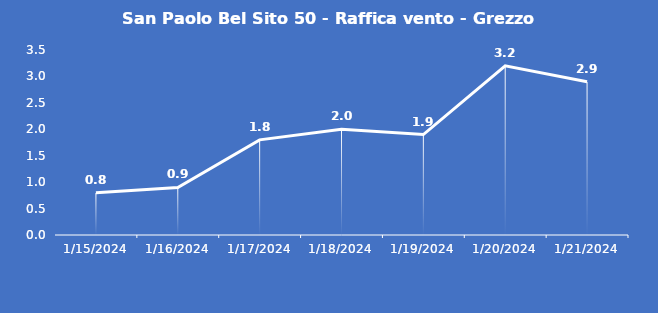
| Category | San Paolo Bel Sito 50 - Raffica vento - Grezzo (m/s) |
|---|---|
| 1/15/24 | 0.8 |
| 1/16/24 | 0.9 |
| 1/17/24 | 1.8 |
| 1/18/24 | 2 |
| 1/19/24 | 1.9 |
| 1/20/24 | 3.2 |
| 1/21/24 | 2.9 |